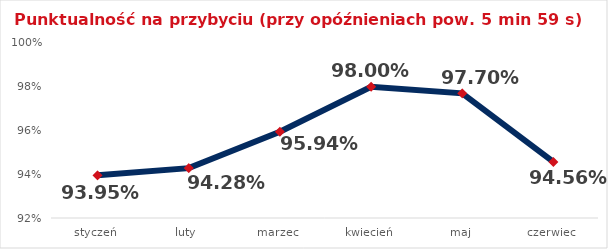
| Category | Series 0 |
|---|---|
| styczeń | 0.94 |
| luty | 0.943 |
| marzec | 0.959 |
| kwiecień | 0.98 |
| maj | 0.977 |
| czerwiec | 0.946 |